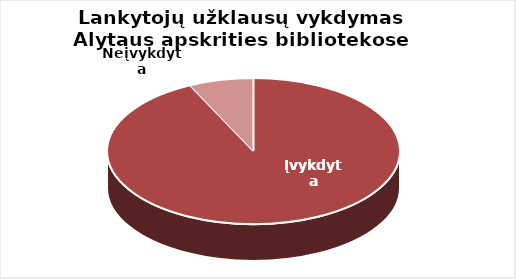
| Category | Series 0 |
|---|---|
| Įvykdyta | 23737 |
| Neįvykdyta | 1821 |